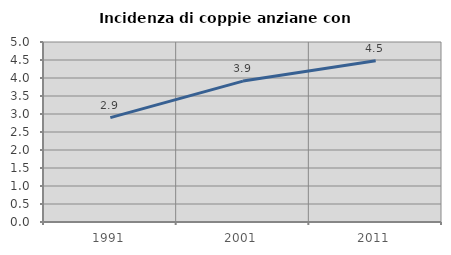
| Category | Incidenza di coppie anziane con figli |
|---|---|
| 1991.0 | 2.901 |
| 2001.0 | 3.914 |
| 2011.0 | 4.476 |